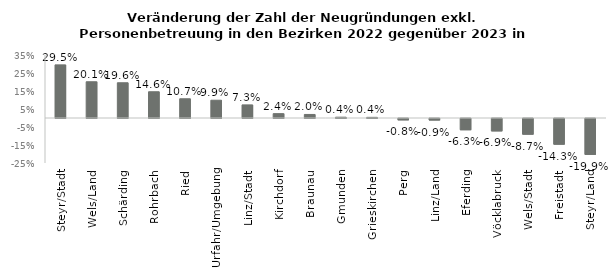
| Category | Series 1 |
|---|---|
| Steyr/Stadt | 0.295 |
| Wels/Land | 0.201 |
| Schärding | 0.196 |
| Rohrbach | 0.146 |
| Ried | 0.107 |
| Urfahr/Umgebung | 0.099 |
| Linz/Stadt | 0.073 |
| Kirchdorf | 0.024 |
| Braunau | 0.02 |
| Gmunden | 0.004 |
| Grieskirchen | 0.004 |
| Perg | -0.008 |
| Linz/Land | -0.009 |
| Eferding | -0.062 |
| Vöcklabruck | -0.069 |
| Wels/Stadt | -0.087 |
| Freistadt | -0.143 |
| Steyr/Land | -0.199 |